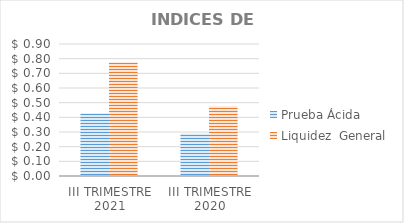
| Category | Prueba Ácida | Liquidez  General | Autonomía |
|---|---|---|---|
| III TRIMESTRE 2021 | 0.428 | 0.775 |  |
| III TRIMESTRE 2020 | 0.289 | 0.476 |  |